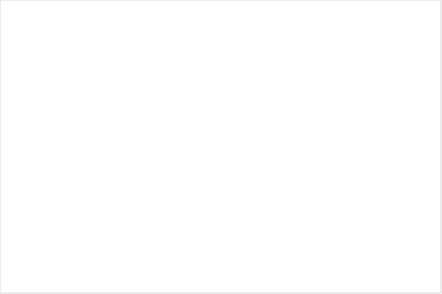
| Category | Series 0 |
|---|---|
| Spotřeba | 0 |
| Rezervy | 0 |
| Zajištění | 0 |
| Bydlení | 0 |
| Střední cíle | 0 |
| Renta | 0 |